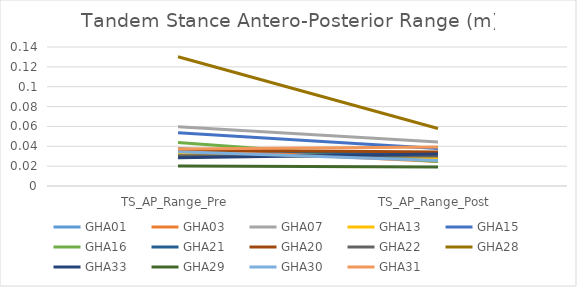
| Category | GHA01 | GHA03 | GHA07 | GHA13 | GHA15 | GHA16 | GHA21 | GHA20 | GHA22 | GHA28 | GHA33 | GHA29 | GHA30 | GHA31 |
|---|---|---|---|---|---|---|---|---|---|---|---|---|---|---|
| TS_AP_Range_Pre | 0.031 | 0.037 | 0.06 | 0.032 | 0.054 | 0.044 | 0.037 | 0.036 | 0.03 | 0.13 | 0.028 | 0.02 | 0.035 | 0.037 |
| TS_AP_Range_Post | 0.033 | 0.025 | 0.044 | 0.028 | 0.038 | 0.025 | 0.031 | 0.034 | 0.03 | 0.058 | 0.032 | 0.019 | 0.026 | 0.039 |